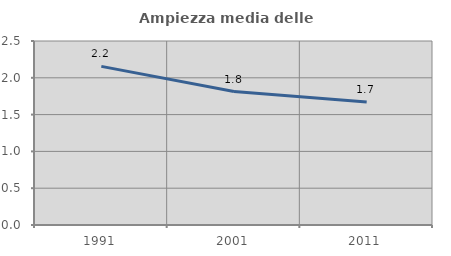
| Category | Ampiezza media delle famiglie |
|---|---|
| 1991.0 | 2.155 |
| 2001.0 | 1.813 |
| 2011.0 | 1.673 |